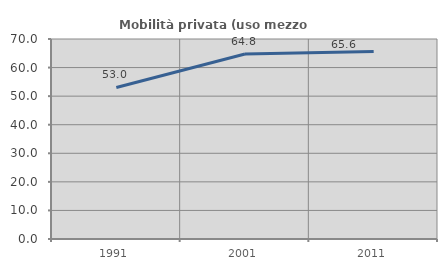
| Category | Mobilità privata (uso mezzo privato) |
|---|---|
| 1991.0 | 53.043 |
| 2001.0 | 64.774 |
| 2011.0 | 65.643 |